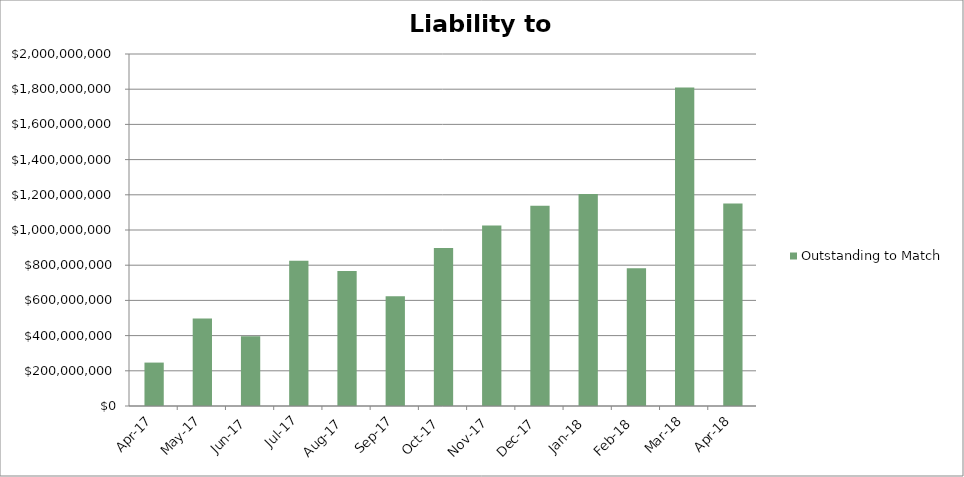
| Category | Outstanding to Match |
|---|---|
| 2017-04-01 | 246700000 |
| 2017-05-01 | 497000000 |
| 2017-06-01 | 397000000 |
| 2017-07-01 | 825000000 |
| 2017-08-01 | 767000000 |
| 2017-09-01 | 624000000 |
| 2017-10-01 | 898000000 |
| 2017-11-01 | 1026000000 |
| 2017-12-01 | 1138000000 |
| 2018-01-01 | 1205000000 |
| 2018-02-01 | 782000000 |
| 2018-03-01 | 1810000000 |
| 2018-04-01 | 1150000000 |